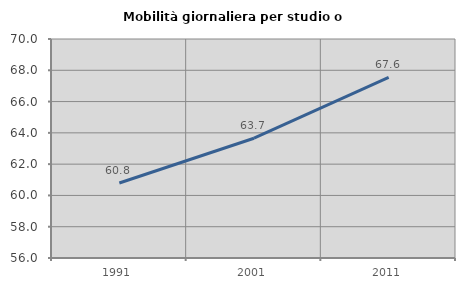
| Category | Mobilità giornaliera per studio o lavoro |
|---|---|
| 1991.0 | 60.792 |
| 2001.0 | 63.656 |
| 2011.0 | 67.554 |